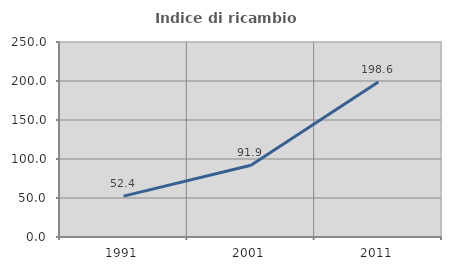
| Category | Indice di ricambio occupazionale  |
|---|---|
| 1991.0 | 52.423 |
| 2001.0 | 91.919 |
| 2011.0 | 198.633 |